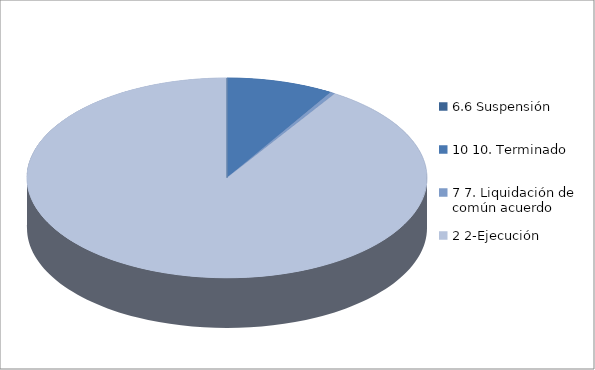
| Category | Series 0 |
|---|---|
| 6.6 Suspensión | 0 |
| 10 10. Terminado | 44 |
| 7 7. Liquidación de común acuerdo | 2 |
| 2 2-Ejecución | 463 |